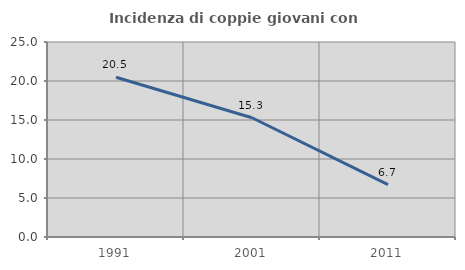
| Category | Incidenza di coppie giovani con figli |
|---|---|
| 1991.0 | 20.478 |
| 2001.0 | 15.287 |
| 2011.0 | 6.709 |